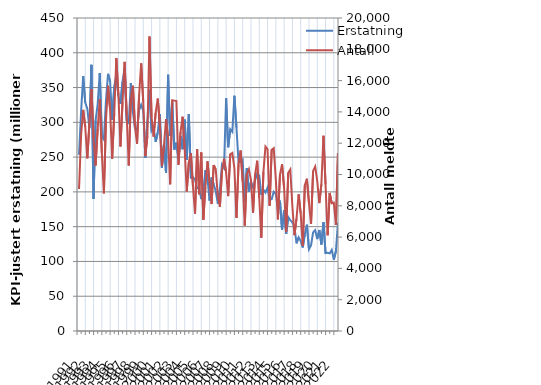
| Category | Erstatning |
|---|---|
| 1991.0 | 253.469 |
| nan | 315.36 |
| nan | 366.519 |
| nan | 328.269 |
| 1992.0 | 319.552 |
| nan | 291.981 |
| nan | 382.641 |
| nan | 189.775 |
| 1993.0 | 302.742 |
| nan | 326.193 |
| nan | 370.855 |
| nan | 280.025 |
| 1994.0 | 275.259 |
| nan | 331.438 |
| nan | 369.692 |
| nan | 358.663 |
| 1995.0 | 303.678 |
| nan | 351.299 |
| nan | 368.914 |
| nan | 337.816 |
| 1996.0 | 326.588 |
| nan | 358.519 |
| nan | 378.266 |
| nan | 302.415 |
| 1997.0 | 298.989 |
| nan | 356.113 |
| nan | 315.206 |
| nan | 291.396 |
| 1998.0 | 289.223 |
| nan | 317.273 |
| nan | 325.337 |
| nan | 316.584 |
| 1999.0 | 248.708 |
| nan | 301.782 |
| nan | 346.828 |
| nan | 287.664 |
| 2000.0 | 293.228 |
| nan | 271.936 |
| nan | 285.248 |
| nan | 311.846 |
| 2001.0 | 234.505 |
| nan | 268.968 |
| nan | 227.131 |
| nan | 368.386 |
| 2002.0 | 280.478 |
| nan | 328.826 |
| nan | 260.77 |
| nan | 270.739 |
| 2003.0 | 247.365 |
| nan | 280.296 |
| nan | 261.363 |
| nan | 303.899 |
| 2004.0 | 246.119 |
| nan | 312.001 |
| nan | 220.435 |
| nan | 221.355 |
| 2005.0 | 217.579 |
| nan | 205.064 |
| nan | 205.915 |
| nan | 189.628 |
| 2006.0 | 200.078 |
| nan | 231.376 |
| nan | 220.674 |
| nan | 187.581 |
| 2007.0 | 220.694 |
| nan | 210.821 |
| nan | 201.064 |
| nan | 183.119 |
| 2008.0 | 203.451 |
| nan | 239.218 |
| nan | 234.438 |
| nan | 334.908 |
| 2009.0 | 264.21 |
| nan | 289.974 |
| nan | 286.344 |
| nan | 338.202 |
| 2010.0 | 292.603 |
| nan | 242.276 |
| nan | 243.27 |
| nan | 246.171 |
| 2011.0 | 186.198 |
| nan | 233.898 |
| nan | 200.278 |
| nan | 214.975 |
| 2012.0 | 206.705 |
| nan | 216.668 |
| nan | 226.437 |
| nan | 223.463 |
| 2013.0 | 195.495 |
| nan | 203.199 |
| nan | 199.023 |
| nan | 206.2 |
| 2014.0 | 188.402 |
| nan | 189.607 |
| nan | 200.172 |
| nan | 197.056 |
| 2015.0 | 173.901 |
| nan | 187.368 |
| nan | 145.441 |
| nan | 173.337 |
| 2016.0 | 139.594 |
| nan | 163.833 |
| nan | 159.014 |
| nan | 156.137 |
| 2017.0 | 149.352 |
| nan | 126.055 |
| nan | 134.611 |
| nan | 129.438 |
| 2018.0 | 120.035 |
| nan | 139.312 |
| nan | 152.844 |
| nan | 117.524 |
| 2019.0 | 123.081 |
| nan | 141.817 |
| nan | 144.981 |
| nan | 132.183 |
| 2020.0 | 145.263 |
| nan | 124.327 |
| nan | 156.564 |
| nan | 111.962 |
| 2021.0 | 112.429 |
| nan | 111.632 |
| nan | 116.581 |
| nan | 102.588 |
| 2022.0 | 114.516 |
| nan | 155.702 |